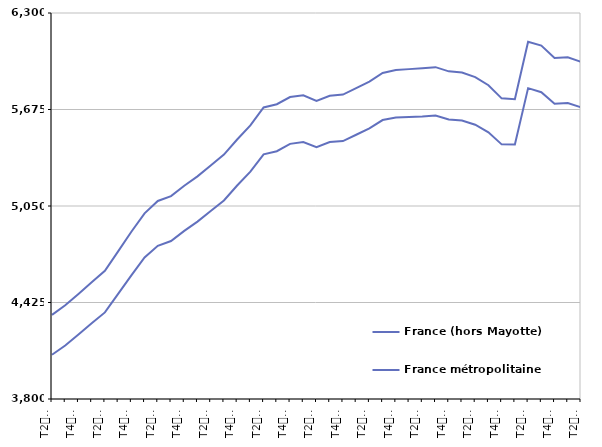
| Category | France (hors Mayotte) | France métropolitaine |
|---|---|---|
| T2
2011 | 4345.1 | 4086.7 |
| T3
2011 | 4407 | 4146.5 |
| T4
2011 | 4480.5 | 4217.6 |
| T1
2012 | 4556.5 | 4290.3 |
| T2
2012 | 4630.7 | 4360.7 |
| T3
2012 | 4756.3 | 4480.8 |
| T4
2012 | 4883 | 4600.9 |
| T1
2013 | 5002.2 | 4716.3 |
| T2
2013 | 5082.7 | 4791.9 |
| T3
2013 | 5114 | 4822.9 |
| T4
2013 | 5181.5 | 4888.7 |
| T1
2014 | 5242 | 4948.8 |
| T2
2014 | 5312.3 | 5017.1 |
| T3
2014 | 5382.6 | 5085.7 |
| T4
2014 | 5480.7 | 5182.8 |
| T1
2015 | 5571.7 | 5272.2 |
| T2
2015 | 5688.4 | 5384.8 |
| T3
2015 | 5709 | 5404.8 |
| T4
2015 | 5755.8 | 5452.5 |
| T1
2016 | 5767.1 | 5464 |
| T2
2016 | 5730 | 5430.7 |
| T3
2016 | 5764.3 | 5464.3 |
| T4
2016 | 5771.7 | 5470.4 |
| T1
2017 | 5813.4 | 5511.3 |
| T2
2017 | 5855.1 | 5552.5 |
| T3
2017 | 5911.8 | 5606.6 |
| T4
2017 | 5931 | 5622.8 |
| T1
2018 | 5936.5 | 5626.6 |
| T2
2018 | 5942.3 | 5629.4 |
| T3
2018 | 5949.2 | 5636.1 |
| T4
2018 | 5922.2 | 5610.7 |
| T1
2019 | 5914.3 | 5603.1 |
| T2
2019 | 5884.6 | 5576.3 |
| T3
2019 | 5832.2 | 5527.4 |
| T4
2019 | 5747.1 | 5449.2 |
| T1
2020 | 5742 | 5448.2 |
| T2
2020 | 6113.9 | 5813.3 |
| T3
2020 | 6089.3 | 5787.1 |
| T4
2020 | 6008.4 | 5712.2 |
| T1
2021 | 6012.6 | 5716.9 |
| T2
2021 | 5984 | 5688.7 |